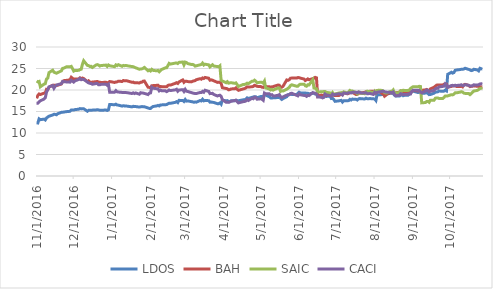
| Category | LDOS | BAH | SAIC | CACI |
|---|---|---|---|---|
| 11/1/16 | 12.394 | 18.057 | 22.082 | 16.935 |
| 11/2/16 | 12.337 | 18.748 | 21.898 | 16.935 |
| 11/3/16 | 13.289 | 19.079 | 21.998 | 17.208 |
| 11/4/16 | 13.101 | 18.947 | 20.738 | 17.488 |
| 11/7/16 | 13.227 | 19.271 | 21.367 | 17.897 |
| 11/8/16 | 13.026 | 19.301 | 21.473 | 18.178 |
| 11/9/16 | 13.478 | 20.167 | 22.561 | 19.498 |
| 11/10/16 | 13.724 | 20.107 | 22.758 | 20.102 |
| 11/11/16 | 13.906 | 20.63 | 24.046 | 20.732 |
| 11/14/16 | 14.191 | 21.123 | 24.602 | 21.03 |
| 11/15/16 | 14.346 | 21.081 | 24.131 | 20.399 |
| 11/16/16 | 14.331 | 21.123 | 24.022 | 20.852 |
| 11/17/16 | 14.236 | 21.044 | 23.904 | 21.15 |
| 11/18/16 | 14.478 | 21.111 | 24.037 | 21.235 |
| 11/21/16 | 14.804 | 21.399 | 24.457 | 21.473 |
| 11/22/16 | 14.81 | 21.946 | 25.02 | 21.992 |
| 11/23/16 | 14.879 | 22.175 | 25.092 | 21.924 |
| 11/25/16 | 14.963 | 22.241 | 25.386 | 21.882 |
| 11/28/16 | 15.044 | 22.361 | 25.389 | 21.822 |
| 11/29/16 | 15.346 | 22.962 | 25.494 | 22.248 |
| 11/30/16 | 15.328 | 22.728 | 24.968 | 22.035 |
| 12/1/16 | 15.328 | 22.15 | 24.403 | 21.839 |
| 12/2/16 | 15.439 | 22.565 | 24.539 | 22.12 |
| 12/5/16 | 15.532 | 22.565 | 24.569 | 22.452 |
| 12/6/16 | 15.682 | 22.818 | 24.748 | 22.682 |
| 12/7/16 | 15.604 | 22.613 | 24.832 | 22.393 |
| 12/8/16 | 15.648 | 22.776 | 25.978 | 22.478 |
| 12/9/16 | 15.643 | 22.662 | 26.807 | 22.452 |
| 12/12/16 | 15.059 | 21.946 | 25.727 | 21.856 |
| 12/13/16 | 15.274 | 22.144 | 25.679 | 21.643 |
| 12/14/16 | 15.268 | 21.862 | 25.476 | 21.541 |
| 12/15/16 | 15.319 | 21.796 | 25.506 | 21.533 |
| 12/16/16 | 15.319 | 21.844 | 25.237 | 21.337 |
| 12/19/16 | 15.37 | 21.928 | 25.818 | 21.499 |
| 12/20/16 | 15.406 | 21.988 | 25.9 | 21.524 |
| 12/21/16 | 15.376 | 21.85 | 25.806 | 21.226 |
| 12/22/16 | 15.292 | 21.814 | 25.57 | 21.218 |
| 12/23/16 | 15.286 | 21.742 | 25.688 | 21.311 |
| 12/27/16 | 15.343 | 21.802 | 25.791 | 21.345 |
| 12/28/16 | 15.238 | 21.646 | 25.485 | 21.098 |
| 12/29/16 | 15.385 | 21.79 | 25.821 | 21.337 |
| 12/30/16 | 16.633 | 21.969 | 25.643 | 19.493 |
| 1/3/17 | 16.571 | 21.756 | 25.425 | 19.501 |
| 1/4/17 | 16.701 | 21.872 | 25.833 | 19.846 |
| 1/5/17 | 16.513 | 21.89 | 25.664 | 19.572 |
| 1/6/17 | 16.477 | 22.055 | 25.888 | 19.525 |
| 1/9/17 | 16.256 | 21.982 | 25.513 | 19.438 |
| 1/10/17 | 16.35 | 22.201 | 25.715 | 19.423 |
| 1/11/17 | 16.295 | 22.158 | 25.624 | 19.438 |
| 1/12/17 | 16.259 | 22.158 | 25.718 | 19.399 |
| 1/13/17 | 16.249 | 22.128 | 25.646 | 19.383 |
| 1/17/17 | 16.074 | 21.805 | 25.446 | 19.18 |
| 1/18/17 | 16.204 | 21.835 | 25.425 | 19.336 |
| 1/19/17 | 16.161 | 21.677 | 25.295 | 19.172 |
| 1/20/17 | 16.152 | 21.708 | 25.162 | 19.321 |
| 1/23/17 | 16.028 | 21.634 | 24.829 | 19.023 |
| 1/24/17 | 16.09 | 21.799 | 24.896 | 19.368 |
| 1/25/17 | 16.148 | 21.823 | 24.914 | 19.289 |
| 1/26/17 | 16.113 | 22.048 | 25.035 | 19.282 |
| 1/27/17 | 16.116 | 22.085 | 25.25 | 19.211 |
| 1/30/17 | 15.813 | 20.648 | 24.475 | 18.944 |
| 1/31/17 | 15.716 | 20.599 | 24.62 | 19.258 |
| 2/1/17 | 15.712 | 20.514 | 24.43 | 19.328 |
| 2/2/17 | 15.966 | 20.995 | 24.805 | 20.63 |
| 2/3/17 | 16.161 | 21.019 | 24.567 | 20.418 |
| 2/6/17 | 16.301 | 21.08 | 24.463 | 20.301 |
| 2/7/17 | 16.415 | 21.123 | 24.549 | 20.277 |
| 2/8/17 | 16.292 | 20.818 | 24.252 | 19.791 |
| 2/9/17 | 16.529 | 20.83 | 24.546 | 19.995 |
| 2/10/17 | 16.535 | 20.77 | 24.78 | 19.83 |
| 2/13/17 | 16.584 | 20.782 | 25.152 | 19.815 |
| 2/14/17 | 16.607 | 20.739 | 25.178 | 19.619 |
| 2/15/17 | 16.789 | 21.05 | 25.654 | 19.783 |
| 2/16/17 | 16.916 | 21.172 | 26.194 | 20.011 |
| 2/17/17 | 16.896 | 21.141 | 26.031 | 19.87 |
| 2/21/17 | 17.127 | 21.549 | 26.257 | 20.034 |
| 2/22/17 | 17.28 | 21.695 | 26.29 | 20.175 |
| 2/23/17 | 17.072 | 21.525 | 26.147 | 19.705 |
| 2/24/17 | 17.589 | 21.878 | 26.426 | 19.987 |
| 2/27/17 | 17.576 | 22.341 | 26.509 | 20.081 |
| 2/28/17 | 17.336 | 21.787 | 25.835 | 19.666 |
| 3/1/17 | 17.788 | 22.042 | 26.486 | 20.144 |
| 3/2/17 | 17.414 | 22.048 | 26.394 | 19.713 |
| 3/3/17 | 17.462 | 21.957 | 26.153 | 19.658 |
| 3/6/17 | 17.293 | 21.89 | 25.936 | 19.391 |
| 3/7/17 | 17.244 | 22.036 | 25.957 | 19.297 |
| 3/8/17 | 17.144 | 22.116 | 25.82 | 19.227 |
| 3/9/17 | 17.215 | 22.176 | 25.55 | 19.195 |
| 3/10/17 | 17.176 | 22.396 | 25.633 | 19.18 |
| 3/13/17 | 17.547 | 22.633 | 25.856 | 19.423 |
| 3/14/17 | 17.459 | 22.524 | 25.936 | 19.399 |
| 3/15/17 | 17.846 | 22.81 | 26.257 | 19.674 |
| 3/16/17 | 17.479 | 22.682 | 25.817 | 19.485 |
| 3/17/17 | 17.547 | 22.913 | 26.007 | 19.94 |
| 3/20/17 | 17.524 | 22.737 | 25.847 | 19.674 |
| 3/21/17 | 17.17 | 22.28 | 25.375 | 19.156 |
| 3/22/17 | 17.196 | 22.359 | 25.645 | 19.18 |
| 3/23/17 | 17.134 | 22.286 | 25.871 | 19.227 |
| 3/24/17 | 17.114 | 22.152 | 25.574 | 18.976 |
| 3/27/17 | 16.822 | 21.774 | 25.458 | 18.615 |
| 3/28/17 | 16.815 | 21.805 | 25.39 | 18.725 |
| 3/29/17 | 16.988 | 21.774 | 25.621 | 18.788 |
| 3/30/17 | 16.692 | 21.543 | 22.27 | 18.544 |
| 3/31/17 | 17.672 | 20.538 | 22.101 | 17.755 |
| 4/3/17 | 17.468 | 20.358 | 21.697 | 17.157 |
| 4/4/17 | 17.523 | 20.294 | 21.938 | 17.157 |
| 4/5/17 | 17.261 | 20.044 | 21.596 | 17.127 |
| 4/6/17 | 17.295 | 20.091 | 21.658 | 17.233 |
| 4/7/17 | 17.496 | 20.253 | 21.697 | 17.384 |
| 4/10/17 | 17.492 | 20.282 | 21.552 | 17.551 |
| 4/11/17 | 17.624 | 20.497 | 21.658 | 17.619 |
| 4/12/17 | 17.537 | 20.172 | 21.234 | 17.293 |
| 4/13/17 | 17.499 | 19.928 | 20.824 | 17.006 |
| 4/17/17 | 17.72 | 20.265 | 21.299 | 17.301 |
| 4/18/17 | 17.748 | 20.334 | 21.293 | 17.316 |
| 4/19/17 | 17.879 | 20.497 | 21.403 | 17.452 |
| 4/20/17 | 18.176 | 20.735 | 21.593 | 17.77 |
| 4/21/17 | 18.042 | 20.688 | 21.48 | 17.558 |
| 4/24/17 | 18.29 | 20.752 | 22.048 | 18.088 |
| 4/25/17 | 18.366 | 20.834 | 22.062 | 17.974 |
| 4/26/17 | 18.453 | 21.089 | 22.282 | 18.33 |
| 4/27/17 | 18.436 | 20.996 | 22.033 | 18.262 |
| 4/28/17 | 18.197 | 20.851 | 21.682 | 17.861 |
| 5/1/17 | 18.484 | 20.799 | 21.822 | 17.959 |
| 5/2/17 | 18.508 | 20.648 | 21.777 | 17.861 |
| 5/3/17 | 18.522 | 20.602 | 21.575 | 17.611 |
| 5/4/17 | 18.795 | 20.805 | 22.074 | 19.291 |
| 5/5/17 | 18.823 | 20.799 | 20.484 | 19.125 |
| 5/8/17 | 18.422 | 20.758 | 20.22 | 19.11 |
| 5/9/17 | 18.159 | 20.648 | 19.994 | 18.852 |
| 5/10/17 | 18.118 | 20.741 | 20.148 | 18.913 |
| 5/11/17 | 18.211 | 20.776 | 19.959 | 18.648 |
| 5/12/17 | 18.201 | 20.886 | 20.11 | 18.603 |
| 5/15/17 | 18.246 | 21.159 | 20.484 | 18.777 |
| 5/16/17 | 18.56 | 21.106 | 20.484 | 18.92 |
| 5/17/17 | 18.062 | 20.677 | 19.662 | 18.489 |
| 5/18/17 | 17.807 | 20.654 | 19.824 | 18.239 |
| 5/19/17 | 18.007 | 20.863 | 19.766 | 18.383 |
| 5/22/17 | 18.443 | 22.342 | 20.173 | 18.807 |
| 5/23/17 | 18.892 | 22.244 | 20.39 | 18.822 |
| 5/24/17 | 18.971 | 22.377 | 20.596 | 18.883 |
| 5/25/17 | 19.051 | 22.743 | 21.025 | 19.193 |
| 5/26/17 | 18.964 | 22.772 | 21.209 | 19.254 |
| 5/30/17 | 18.954 | 22.778 | 20.877 | 18.754 |
| 5/31/17 | 19.199 | 22.888 | 20.885 | 18.633 |
| 6/1/17 | 19.479 | 22.871 | 21.193 | 19.117 |
| 6/2/17 | 19.334 | 22.76 | 21.352 | 18.89 |
| 6/5/17 | 19.31 | 22.546 | 21.355 | 18.731 |
| 6/6/17 | 19.327 | 22.209 | 20.981 | 18.731 |
| 6/7/17 | 19.237 | 22.372 | 20.879 | 18.519 |
| 6/8/17 | 19.258 | 22.58 | 21.22 | 18.754 |
| 6/9/17 | 19.134 | 22.383 | 21.176 | 18.694 |
| 6/12/17 | 19.22 | 22.633 | 22.383 | 19.405 |
| 6/13/17 | 19.244 | 22.743 | 20.481 | 19.299 |
| 6/14/17 | 19.054 | 22.94 | 20.385 | 19.216 |
| 6/15/17 | 19.065 | 22.824 | 20.291 | 19.087 |
| 6/16/17 | 18.653 | 18.512 | 19.511 | 18.383 |
| 6/19/17 | 18.636 | 18.837 | 19.59 | 18.308 |
| 6/20/17 | 18.446 | 18.704 | 19.607 | 18.164 |
| 6/21/17 | 18.574 | 18.774 | 19.632 | 18.292 |
| 6/22/17 | 18.526 | 19.087 | 19.64 | 19.057 |
| 6/23/17 | 18.508 | 18.698 | 19.464 | 18.852 |
| 6/26/17 | 18.56 | 18.832 | 19.324 | 18.694 |
| 6/27/17 | 18.021 | 18.704 | 19.013 | 18.565 |
| 6/28/17 | 18.066 | 18.971 | 19.414 | 19.057 |
| 6/29/17 | 17.783 | 18.774 | 18.991 | 18.852 |
| 6/30/17 | 17.366 | 18.696 | 19.079 | 18.963 |
| 7/3/17 | 17.474 | 18.702 | 19.285 | 19.122 |
| 7/5/17 | 17.591 | 19.024 | 19.398 | 19.054 |
| 7/6/17 | 17.198 | 18.944 | 19.126 | 18.836 |
| 7/7/17 | 17.494 | 19.392 | 19.563 | 19.32 |
| 7/10/17 | 17.494 | 19.11 | 19.316 | 19.198 |
| 7/11/17 | 17.544 | 19.202 | 19.588 | 19.388 |
| 7/12/17 | 17.836 | 19.455 | 19.893 | 19.388 |
| 7/13/17 | 17.675 | 19.449 | 19.725 | 19.297 |
| 7/14/17 | 17.887 | 19.438 | 19.761 | 19.456 |
| 7/17/17 | 17.833 | 18.961 | 19.404 | 19.494 |
| 7/18/17 | 17.668 | 18.961 | 19.11 | 19.342 |
| 7/19/17 | 17.937 | 19.254 | 19.524 | 19.547 |
| 7/20/17 | 18.015 | 19.271 | 19.423 | 19.479 |
| 7/21/17 | 17.954 | 19.34 | 19.228 | 19.304 |
| 7/24/17 | 17.924 | 19.443 | 19.142 | 19.327 |
| 7/25/17 | 18.105 | 19.616 | 19.492 | 19.357 |
| 7/26/17 | 17.968 | 19.627 | 19.728 | 19.115 |
| 7/27/17 | 17.941 | 19.506 | 19.643 | 19.153 |
| 7/28/17 | 18.008 | 19.685 | 19.632 | 19.206 |
| 7/31/17 | 17.954 | 19.708 | 19.351 | 18.971 |
| 8/1/17 | 17.914 | 19.759 | 19.728 | 19.471 |
| 8/2/17 | 17.561 | 19.547 | 19.274 | 19.191 |
| 8/3/17 | 19.029 | 19.8 | 19.879 | 19.471 |
| 8/4/17 | 18.878 | 19.886 | 19.939 | 19.524 |
| 8/7/17 | 18.932 | 19.185 | 19.908 | 19.661 |
| 8/8/17 | 19.036 | 19.047 | 19.718 | 19.752 |
| 8/9/17 | 18.875 | 18.558 | 19.42 | 19.585 |
| 8/10/17 | 18.972 | 18.771 | 19.3 | 19.539 |
| 8/11/17 | 19.043 | 19.11 | 19.312 | 19.494 |
| 8/14/17 | 19.274 | 19.357 | 19.682 | 19.426 |
| 8/15/17 | 19.251 | 19.363 | 19.68 | 19.342 |
| 8/16/17 | 19.221 | 19.506 | 20.011 | 19.532 |
| 8/17/17 | 18.794 | 19.254 | 19.392 | 19.001 |
| 8/18/17 | 18.592 | 19.351 | 19.267 | 18.652 |
| 8/21/17 | 18.582 | 19.489 | 19.418 | 18.781 |
| 8/22/17 | 18.784 | 19.782 | 19.841 | 19.145 |
| 8/23/17 | 18.888 | 19.754 | 19.749 | 19.024 |
| 8/24/17 | 18.663 | 19.535 | 19.941 | 18.963 |
| 8/25/17 | 18.767 | 19.518 | 19.902 | 18.933 |
| 8/28/17 | 18.781 | 19.271 | 19.905 | 19.001 |
| 8/29/17 | 19.022 | 19.489 | 20.028 | 19.107 |
| 8/30/17 | 19.264 | 19.472 | 20.348 | 19.092 |
| 8/31/17 | 19.594 | 19.598 | 20.588 | 19.683 |
| 9/1/17 | 19.735 | 19.914 | 20.738 | 19.964 |
| 9/5/17 | 19.419 | 19.794 | 20.755 | 19.941 |
| 9/6/17 | 19.473 | 19.96 | 20.858 | 19.881 |
| 9/7/17 | 19.385 | 19.972 | 20.805 | 19.6 |
| 9/8/17 | 19.187 | 19.926 | 17.015 | 19.342 |
| 9/11/17 | 19.288 | 20.035 | 17.085 | 19.744 |
| 9/12/17 | 19.379 | 20.121 | 17.325 | 20.01 |
| 9/13/17 | 19.197 | 19.88 | 17.342 | 19.956 |
| 9/14/17 | 18.925 | 19.794 | 17.135 | 19.562 |
| 9/15/17 | 18.948 | 20.254 | 17.634 | 19.691 |
| 9/18/17 | 19.261 | 20.644 | 17.634 | 19.903 |
| 9/19/17 | 19.493 | 20.88 | 18.086 | 20.252 |
| 9/20/17 | 19.543 | 21.127 | 18.164 | 20.426 |
| 9/21/17 | 19.577 | 21.173 | 18.158 | 20.381 |
| 9/22/17 | 19.765 | 21.178 | 18.021 | 20.707 |
| 9/25/17 | 19.681 | 21.178 | 18.021 | 20.836 |
| 9/26/17 | 19.731 | 21.345 | 18.275 | 20.889 |
| 9/27/17 | 19.966 | 21.403 | 18.59 | 21.427 |
| 9/28/17 | 19.792 | 21.351 | 18.587 | 21.185 |
| 9/29/17 | 23.644 | 20.666 | 18.629 | 20.632 |
| 10/2/17 | 24.119 | 20.831 | 18.913 | 21.054 |
| 10/3/17 | 23.924 | 20.969 | 18.866 | 21.083 |
| 10/4/17 | 24.055 | 21.008 | 19.025 | 20.95 |
| 10/5/17 | 24.566 | 20.964 | 19.342 | 21.113 |
| 10/6/17 | 24.654 | 20.831 | 19.337 | 21.054 |
| 10/9/17 | 24.754 | 20.804 | 19.498 | 21.12 |
| 10/10/17 | 24.814 | 20.886 | 19.599 | 21.216 |
| 10/11/17 | 24.81 | 20.726 | 19.518 | 21.046 |
| 10/12/17 | 24.882 | 21.185 | 19.278 | 21.068 |
| 10/13/17 | 25.057 | 21.312 | 19.214 | 21.246 |
| 10/16/17 | 24.786 | 21.063 | 19.175 | 21.098 |
| 10/17/17 | 24.682 | 20.787 | 18.919 | 20.942 |
| 10/18/17 | 24.514 | 20.859 | 19.153 | 20.957 |
| 10/19/17 | 24.562 | 20.876 | 19.462 | 20.965 |
| 10/20/17 | 24.826 | 20.969 | 19.752 | 21.194 |
| 10/23/17 | 24.666 | 20.859 | 19.911 | 21.179 |
| 10/24/17 | 24.45 | 20.853 | 20.117 | 21.216 |
| 10/25/17 | 25.049 | 20.765 | 20.334 | 21.401 |
| 10/26/17 | 24.942 | 20.71 | 20.404 | 21.438 |
| 10/27/17 | 24.898 | 20.748 | 20.524 | 21.416 |